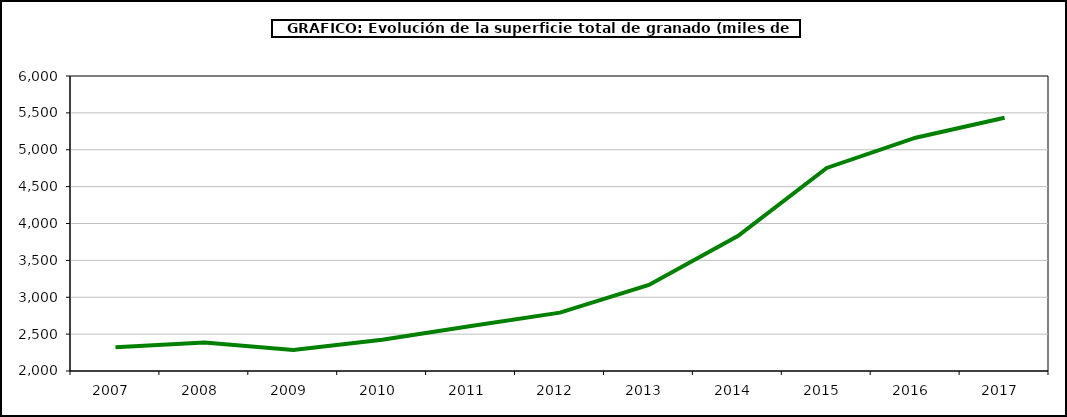
| Category | superficie granado |
|---|---|
| 2007.0 | 2321 |
| 2008.0 | 2387 |
| 2009.0 | 2285 |
| 2010.0 | 2425 |
| 2011.0 | 2610 |
| 2012.0 | 2791 |
| 2013.0 | 3167 |
| 2014.0 | 3830 |
| 2015.0 | 4753 |
| 2016.0 | 5163 |
| 2017.0 | 5434 |